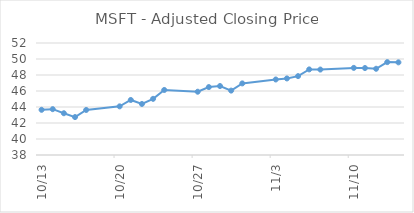
| Category | Adj Close |
|---|---|
| 2014-11-14 | 49.58 |
| 2014-11-13 | 49.61 |
| 2014-11-12 | 48.78 |
| 2014-11-11 | 48.87 |
| 2014-11-10 | 48.89 |
| 2014-11-07 | 48.68 |
| 2014-11-06 | 48.7 |
| 2014-11-05 | 47.86 |
| 2014-11-04 | 47.57 |
| 2014-11-03 | 47.44 |
| 2014-10-31 | 46.95 |
| 2014-10-30 | 46.05 |
| 2014-10-29 | 46.62 |
| 2014-10-28 | 46.49 |
| 2014-10-27 | 45.91 |
| 2014-10-24 | 46.13 |
| 2014-10-23 | 45.02 |
| 2014-10-22 | 44.38 |
| 2014-10-21 | 44.88 |
| 2014-10-20 | 44.08 |
| 2014-10-17 | 43.63 |
| 2014-10-16 | 42.74 |
| 2014-10-15 | 43.22 |
| 2014-10-14 | 43.73 |
| 2014-10-13 | 43.65 |